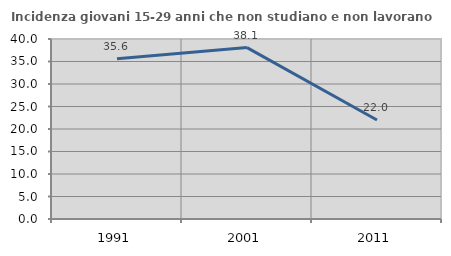
| Category | Incidenza giovani 15-29 anni che non studiano e non lavorano  |
|---|---|
| 1991.0 | 35.622 |
| 2001.0 | 38.095 |
| 2011.0 | 22 |